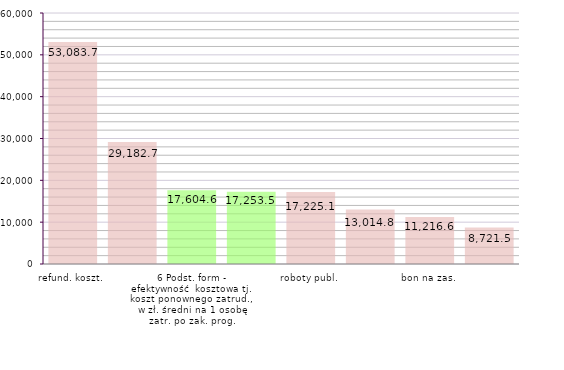
| Category | Efektywność |
|---|---|
| refund. koszt. | 53083.715 |
| dof. działaln. | 29182.743 |
| 6 Podst. form - efektywność  kosztowa tj. koszt ponownego zatrud.,  w zł. średni na 1 osobę zatr. po zak. prog. | 17604.605 |
| 7 Podst. form - efektywność  kosztowa tj. koszt ponownego zatrud.,  w zł. średni na 1 osobę zatr. po zak. prog. | 17253.479 |
| roboty publ. | 17225.129 |
| staże | 13014.846 |
| bon na zas. | 11216.649 |
| prace interw. | 8721.524 |